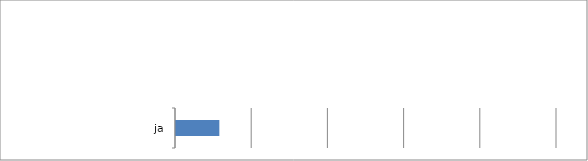
| Category | Series 0 |
|---|---|
| ja | 11.376 |